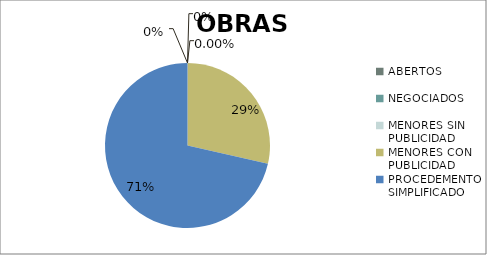
| Category | Series 0 |
|---|---|
| ABERTOS  | 0 |
| NEGOCIADOS  | 0 |
| MENORES SIN PUBLICIDAD | 0 |
| MENORES CON PUBLICIDAD | 0.286 |
| PROCEDEMENTO SIMPLIFICADO | 0.714 |